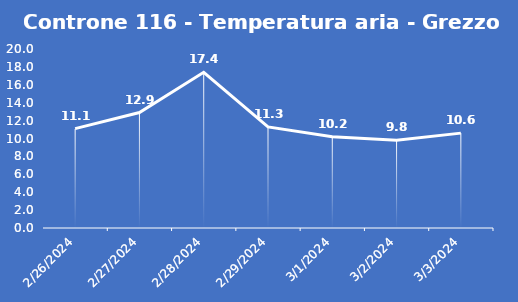
| Category | Controne 116 - Temperatura aria - Grezzo (°C) |
|---|---|
| 2/26/24 | 11.1 |
| 2/27/24 | 12.9 |
| 2/28/24 | 17.4 |
| 2/29/24 | 11.3 |
| 3/1/24 | 10.2 |
| 3/2/24 | 9.8 |
| 3/3/24 | 10.6 |